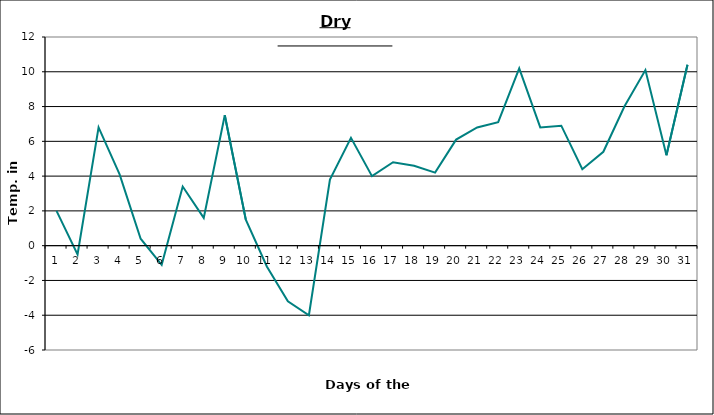
| Category | Series 0 |
|---|---|
| 0 | 2 |
| 1 | -0.5 |
| 2 | 6.8 |
| 3 | 4.1 |
| 4 | 0.4 |
| 5 | -1.1 |
| 6 | 3.4 |
| 7 | 1.6 |
| 8 | 7.5 |
| 9 | 1.5 |
| 10 | -1.2 |
| 11 | -3.2 |
| 12 | -4 |
| 13 | 3.8 |
| 14 | 6.2 |
| 15 | 4 |
| 16 | 4.8 |
| 17 | 4.6 |
| 18 | 4.2 |
| 19 | 6.1 |
| 20 | 6.8 |
| 21 | 7.1 |
| 22 | 10.2 |
| 23 | 6.8 |
| 24 | 6.9 |
| 25 | 4.4 |
| 26 | 5.4 |
| 27 | 8 |
| 28 | 10.1 |
| 29 | 5.2 |
| 30 | 10.4 |